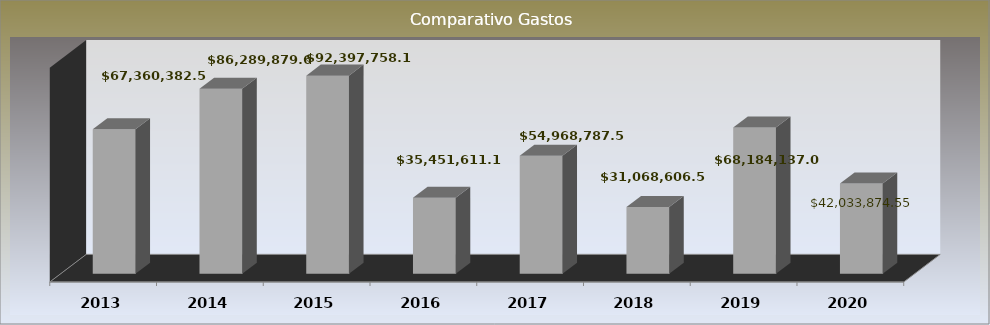
| Category | Series 0 |
|---|---|
| 2013.0 | 67360382.57 |
| 2014.0 | 86289879.62 |
| 2015.0 | 92397758.15 |
| 2016.0 | 35451611.18 |
| 2017.0 | 54968787.54 |
| 2018.0 | 31068606.51 |
| 2019.0 | 68184137.03 |
| 2020.0 | 42033874.55 |